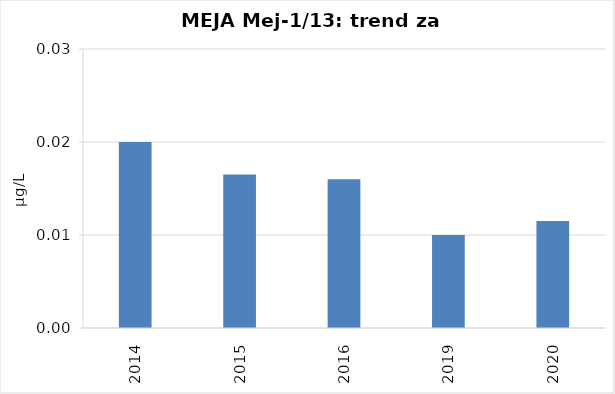
| Category | Vsota |
|---|---|
| 2014 | 0.02 |
| 2015 | 0.016 |
| 2016 | 0.016 |
| 2019 | 0.01 |
| 2020 | 0.012 |